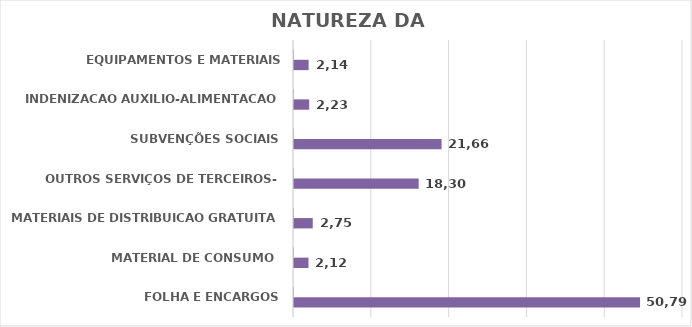
| Category | Series 3 | Series 5 |
|---|---|---|
| FOLHA E ENCARGOS | 8896024.21 | 50.792 |
| MATERIAL DE CONSUMO  | 371896.69 | 2.123 |
| MATERIAIS DE DISTRIBUICAO GRATUITA | 481983.08 | 2.752 |
| OUTROS SERVIÇOS DE TERCEIROS- | 3205099.93 | 18.3 |
| SUBVENÇÕES SOCIAIS | 3793675.56 | 21.66 |
| INDENIZACAO AUXILIO-ALIMENTACAO | 390219.87 | 2.228 |
| EQUIPAMENTOS E MATERIAIS PERMANENTES | 375653.65 | 2.145 |